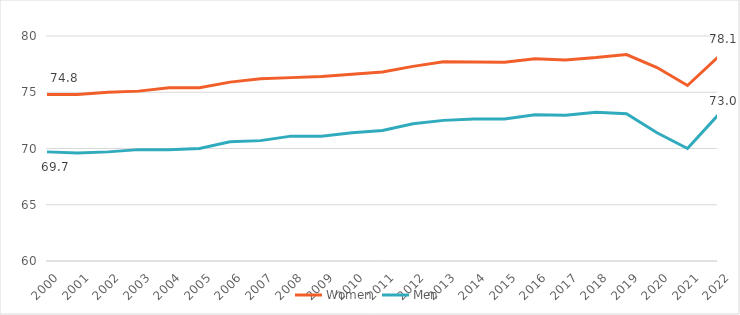
| Category | Women | Men |
|---|---|---|
| 2000.0 | 74.8 | 69.7 |
| 2001.0 | 74.8 | 69.6 |
| 2002.0 | 75 | 69.7 |
| 2003.0 | 75.1 | 69.9 |
| 2004.0 | 75.4 | 69.9 |
| 2005.0 | 75.4 | 70 |
| 2006.0 | 75.9 | 70.6 |
| 2007.0 | 76.2 | 70.7 |
| 2008.0 | 76.3 | 71.1 |
| 2009.0 | 76.4 | 71.1 |
| 2010.0 | 76.6 | 71.4 |
| 2011.0 | 76.8 | 71.6 |
| 2012.0 | 77.3 | 72.2 |
| 2013.0 | 77.7 | 72.5 |
| 2014.0 | 77.697 | 72.612 |
| 2015.0 | 77.674 | 72.625 |
| 2016.0 | 77.978 | 73.005 |
| 2017.0 | 77.876 | 72.95 |
| 2018.0 | 78.079 | 73.222 |
| 2019.0 | 78.347 | 73.087 |
| 2020.0 | 77.2 | 71.4 |
| 2021.0 | 75.6 | 70 |
| 2022.0 | 78.121 | 72.968 |